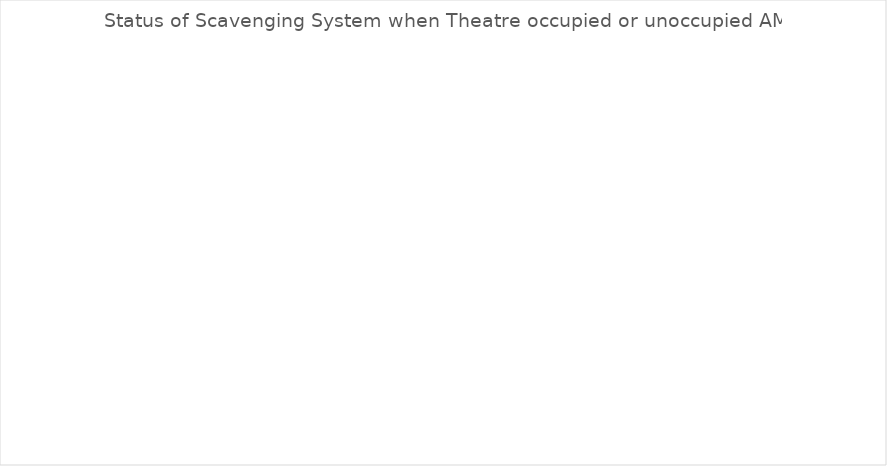
| Category | Series 0 |
|---|---|
| Appropriately on | 0 |
| Inappropriately off | 0 |
| Inappropriately on | 0 |
| Appropriately off | 0 |